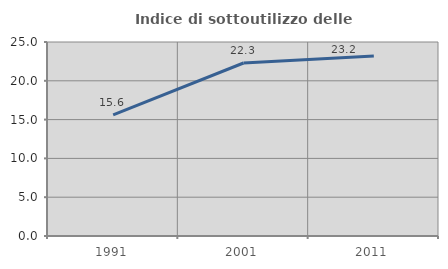
| Category | Indice di sottoutilizzo delle abitazioni  |
|---|---|
| 1991.0 | 15.613 |
| 2001.0 | 22.296 |
| 2011.0 | 23.183 |